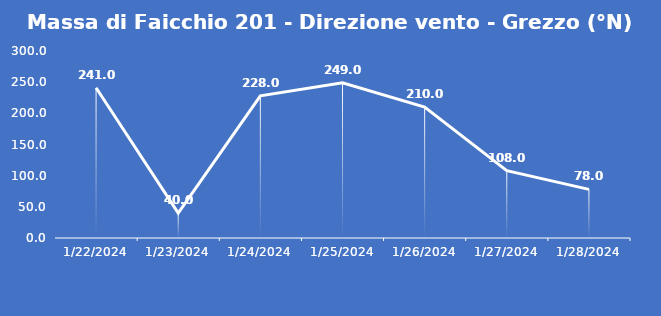
| Category | Massa di Faicchio 201 - Direzione vento - Grezzo (°N) |
|---|---|
| 1/22/24 | 241 |
| 1/23/24 | 40 |
| 1/24/24 | 228 |
| 1/25/24 | 249 |
| 1/26/24 | 210 |
| 1/27/24 | 108 |
| 1/28/24 | 78 |